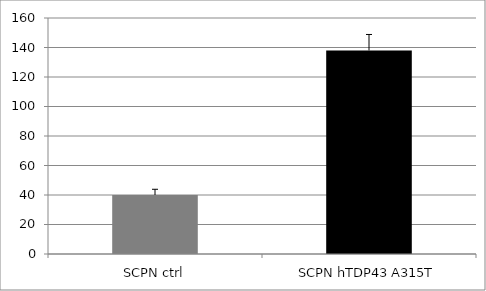
| Category | Series 0 |
|---|---|
| SCPN ctrl | 40 |
| SCPN hTDP43 A315T | 138 |